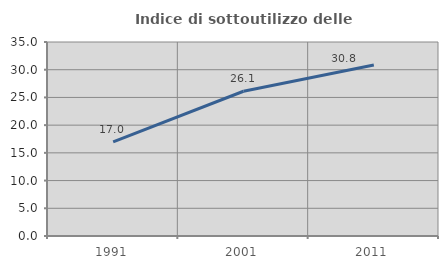
| Category | Indice di sottoutilizzo delle abitazioni  |
|---|---|
| 1991.0 | 16.984 |
| 2001.0 | 26.112 |
| 2011.0 | 30.849 |